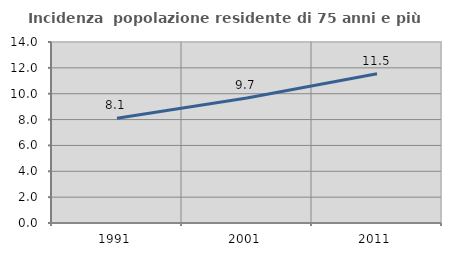
| Category | Incidenza  popolazione residente di 75 anni e più |
|---|---|
| 1991.0 | 8.1 |
| 2001.0 | 9.663 |
| 2011.0 | 11.538 |